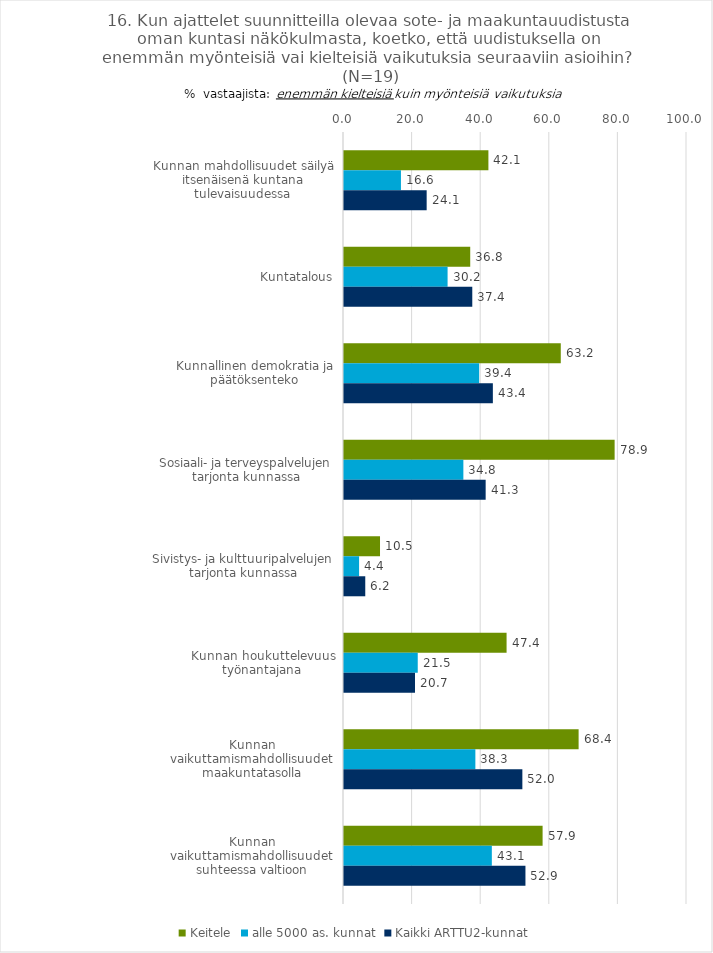
| Category | Keitele | alle 5000 as. kunnat | Kaikki ARTTU2-kunnat |
|---|---|---|---|
| Kunnan mahdollisuudet säilyä itsenäisenä kuntana tulevaisuudessa | 42.1 | 16.6 | 24.1 |
| Kuntatalous | 36.8 | 30.2 | 37.4 |
| Kunnallinen demokratia ja päätöksenteko | 63.2 | 39.4 | 43.4 |
| Sosiaali- ja terveyspalvelujen tarjonta kunnassa | 78.9 | 34.8 | 41.3 |
| Sivistys- ja kulttuuripalvelujen tarjonta kunnassa | 10.5 | 4.4 | 6.2 |
| Kunnan houkuttelevuus työnantajana | 47.4 | 21.5 | 20.7 |
| Kunnan vaikuttamismahdollisuudet maakuntatasolla | 68.4 | 38.3 | 52 |
| Kunnan vaikuttamismahdollisuudet suhteessa valtioon | 57.9 | 43.1 | 52.9 |